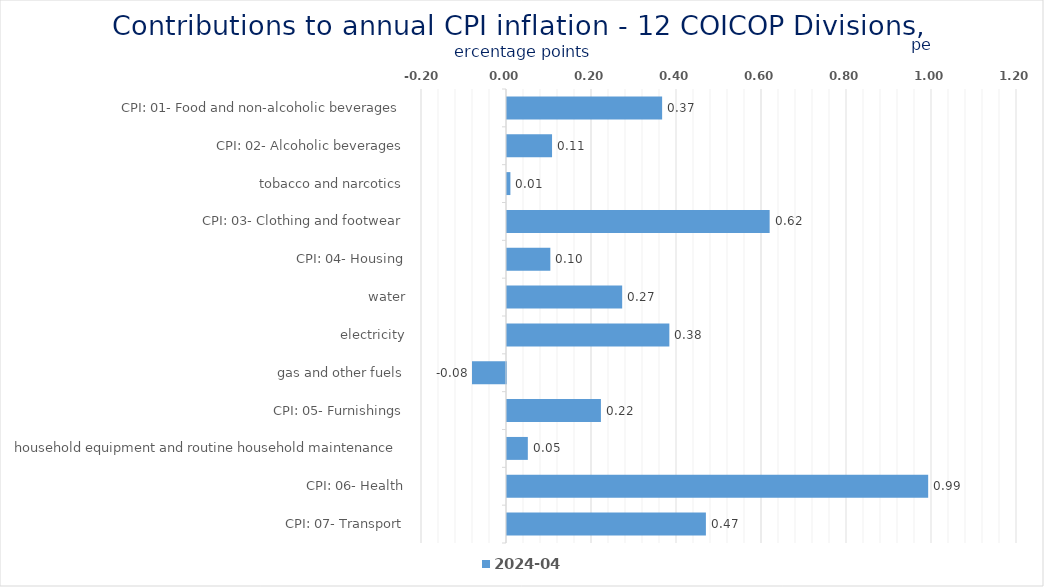
| Category | 2024-04 |
|---|---|
| CPI: 01- Food and non-alcoholic beverages | 0.365 |
| CPI: 02- Alcoholic beverages, tobacco and narcotics | 0.106 |
| CPI: 03- Clothing and footwear | 0.008 |
| CPI: 04- Housing, water, electricity, gas and other fuels | 0.618 |
| CPI: 05- Furnishings, household equipment and routine household maintenance | 0.102 |
| CPI: 06- Health | 0.271 |
| CPI: 07- Transport | 0.382 |
| CPI: 08- Communication | -0.08 |
| CPI: 09- Recreation and culture | 0.221 |
| CPI: 10- Education | 0.049 |
| CPI: 11- Restaurants and hotels | 0.991 |
| CPI: 12- Miscellaneous goods and services | 0.468 |